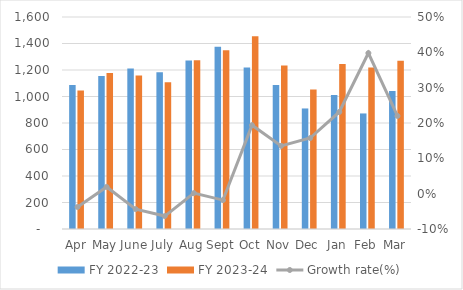
| Category | FY 2022-23 | FY 2023-24 |
|---|---|---|
| Apr | 1086 | 1045 |
| May | 1155 | 1177 |
| June | 1211 | 1158 |
| July | 1183 | 1108 |
| Aug | 1271 | 1273 |
| Sept | 1375 | 1350 |
| Oct | 1218 | 1454 |
| Nov | 1087 | 1234 |
| Dec | 909.694 | 1053 |
| Jan | 1012 | 1246 |
| Feb | 872.062 | 1219 |
| Mar | 1041 | 1270 |